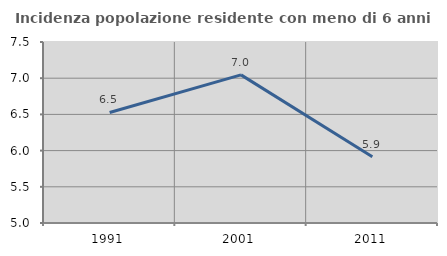
| Category | Incidenza popolazione residente con meno di 6 anni |
|---|---|
| 1991.0 | 6.527 |
| 2001.0 | 7.046 |
| 2011.0 | 5.914 |